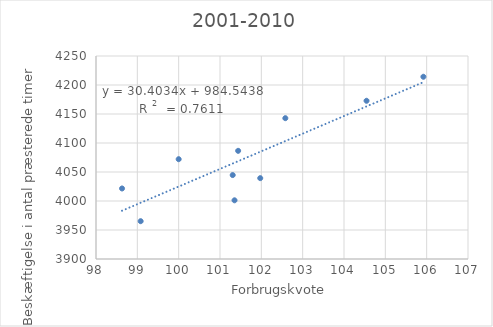
| Category | Series 0 |
|---|---|
| 101.43884892086331 | 4086.5 |
| 100.0 | 4072.1 |
| 98.63013698630137 | 4021.6 |
| 101.35135135135135 | 4001.2 |
| 101.9736842105263 | 4039.4 |
| 102.58064516129033 | 4142.8 |
| 104.54545454545455 | 4172.8 |
| 105.92105263157893 | 4214.2 |
| 101.30718954248366 | 4044.7 |
| 99.08045977011494 | 3965.2 |